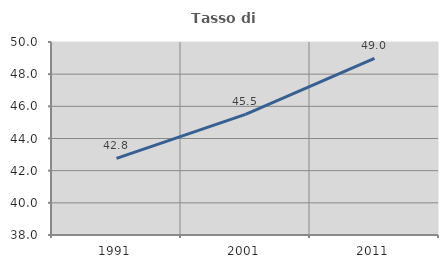
| Category | Tasso di occupazione   |
|---|---|
| 1991.0 | 42.76 |
| 2001.0 | 45.502 |
| 2011.0 | 48.976 |